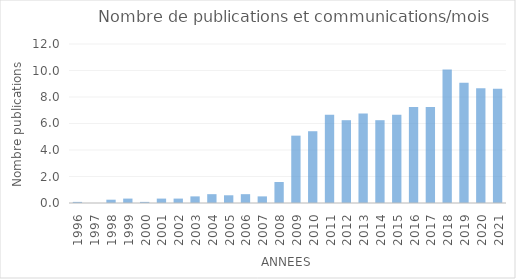
| Category | Series 0 |
|---|---|
| 1996.0 | 0.083 |
| 1997.0 | 0 |
| 1998.0 | 0.25 |
| 1999.0 | 0.333 |
| 2000.0 | 0.083 |
| 2001.0 | 0.333 |
| 2002.0 | 0.333 |
| 2003.0 | 0.5 |
| 2004.0 | 0.667 |
| 2005.0 | 0.583 |
| 2006.0 | 0.667 |
| 2007.0 | 0.5 |
| 2008.0 | 1.583 |
| 2009.0 | 5.083 |
| 2010.0 | 5.417 |
| 2011.0 | 6.667 |
| 2012.0 | 6.25 |
| 2013.0 | 6.75 |
| 2014.0 | 6.25 |
| 2015.0 | 6.667 |
| 2016.0 | 7.25 |
| 2017.0 | 7.25 |
| 2018.0 | 10.083 |
| 2019.0 | 9.083 |
| 2020.0 | 8.667 |
| 2021.0 | 8.625 |